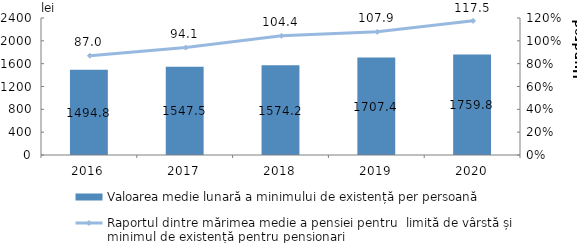
| Category | Valoarea medie lunară a minimului de existență per persoană |
|---|---|
| 2016.0 | 1494.8 |
| 2017.0 | 1547.5 |
| 2018.0 | 1574.2 |
| 2019.0 | 1707.4 |
| 2020.0 | 1759.8 |